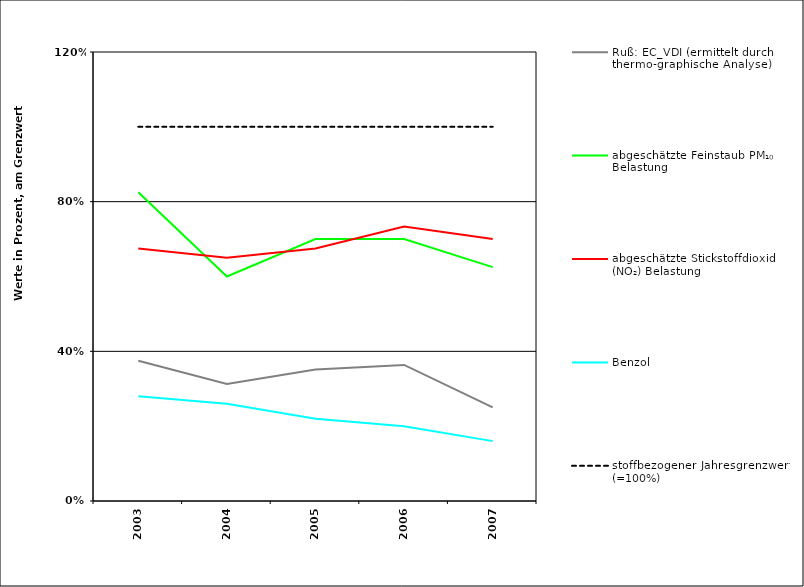
| Category | Ruß: EC_VDI (ermittelt durch thermo-graphische Analyse) | abgeschätzte Feinstaub PM₁₀ Belastung | abgeschätzte Stickstoffdioxid (NO₂) Belastung | Benzol | stoffbezogener Jahresgrenzwert (=100%) |
|---|---|---|---|---|---|
| 2003.0 | 0.375 | 0.825 | 0.675 | 0.28 | 1 |
| 2004.0 | 0.312 | 0.6 | 0.65 | 0.26 | 1 |
| 2005.0 | 0.351 | 0.7 | 0.675 | 0.22 | 1 |
| 2006.0 | 0.364 | 0.7 | 0.734 | 0.2 | 1 |
| 2007.0 | 0.25 | 0.625 | 0.7 | 0.16 | 1 |